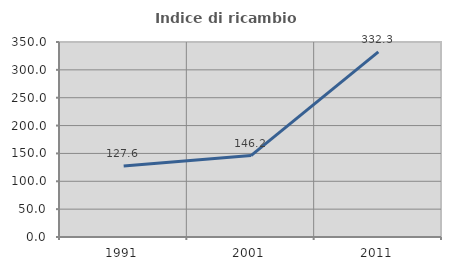
| Category | Indice di ricambio occupazionale  |
|---|---|
| 1991.0 | 127.586 |
| 2001.0 | 146.154 |
| 2011.0 | 332.258 |